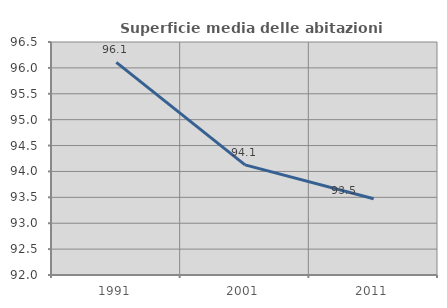
| Category | Superficie media delle abitazioni occupate |
|---|---|
| 1991.0 | 96.108 |
| 2001.0 | 94.128 |
| 2011.0 | 93.473 |